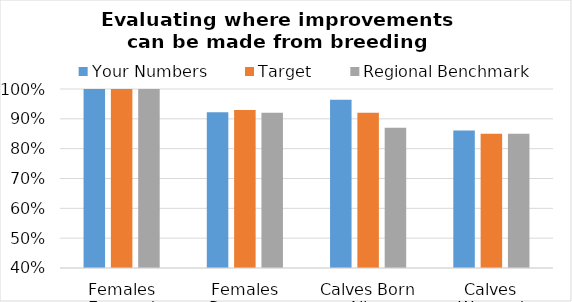
| Category | Your Numbers | Target | Regional Benchmark |
|---|---|---|---|
| Females Exposed | 1 | 1 | 1 |
| Females Pregnant | 0.922 | 0.93 | 0.92 |
| Calves Born Alive | 0.964 | 0.92 | 0.87 |
| Calves Weaned | 0.861 | 0.85 | 0.85 |